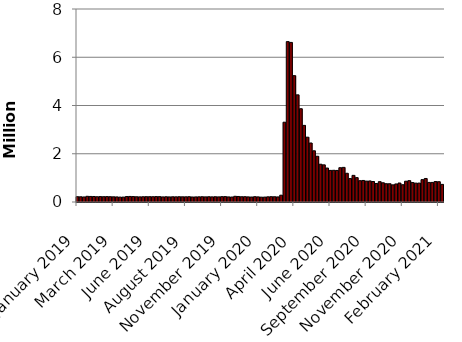
| Category | Series 0 |
|---|---|
| January 2019 | 220000 |
| January 2019 | 216000 |
| January 2019 | 209000 |
| January 2019 | 236000 |
| February 2019 | 230000 |
| February 2019 | 228000 |
| February 2019 | 218000 |
| February 2019 | 224000 |
| March 2019 | 220000 |
| March 2019 | 224000 |
| March 2019 | 219000 |
| March 2019 | 215000 |
| March 2019 | 211000 |
| April 2019 | 203000 |
| April 2019 | 203000 |
| April 2019 | 226000 |
| April 2019 | 230000 |
| May 2019 | 225000 |
| May 2019 | 217000 |
| May 2019 | 213000 |
| May 2019 | 218000 |
| June 2019 | 220000 |
| June 2019 | 220000 |
| June 2019 | 219000 |
| June 2019 | 224000 |
| June 2019 | 222000 |
| July 2019 | 211000 |
| July 2019 | 217000 |
| July 2019 | 211000 |
| July 2019 | 216000 |
| August 2019 | 214000 |
| August 2019 | 218000 |
| August 2019 | 215000 |
| August 2019 | 215000 |
| August 2019 | 219000 |
| September 2019 | 208000 |
| September 2019 | 211000 |
| September 2019 | 215000 |
| September 2019 | 218000 |
| October 2019 | 212000 |
| October 2019 | 218000 |
| September 2019 | 213000 |
| September 2019 | 217000 |
| November 2019 | 212000 |
| November 2019 | 222000 |
| November 2019 | 223000 |
| November 2019 | 211000 |
| November 2019 | 206000 |
| December 2019 | 237000 |
| December 2019 | 229000 |
| December 2019 | 218000 |
| December 2019 | 220000 |
| January 2020 | 212000 |
| January 2020 | 207000 |
| January 2020 | 220000 |
| January 2020 | 212000 |
| February 2020 | 201000 |
| February 2020 | 204000 |
| February 2020 | 215000 |
| February 2020 | 220000 |
| February 2020 | 217000 |
| March 2020 | 211000 |
| March 2020 | 282000 |
| 2020 Mar | 3307000 |
| March 2020 | 6648000 |
| April 2020 | 6615000 |
| April 2020 | 5237000 |
| April 2020 | 4442000 |
| April 2020 | 3867000 |
| May 2020 | 3176000 |
| May 2020 | 2687000 |
| May 2020 | 2446000 |
| May 2020 | 2123000 |
| May 2020 | 1897000 |
| June 2020 | 1566000 |
| June 2020 | 1540000 |
| June 2020 | 1408000 |
| June 2020 | 1310000 |
| July 2020 | 1314000 |
| July 2020 | 1308000 |
| July 2020 | 1422000 |
| July 2020 | 1435000 |
| August 2020 | 1191000 |
| August 2020 | 971000 |
| August 2020 | 1104000 |
| August 2020 | 1011000 |
| August 2020 | 884000 |
| September 2020 | 893000 |
| September 2020 | 866000 |
| September 2020 | 873000 |
| September 2020 | 849000 |
| October 2020 | 767000 |
| October 2020 | 842000 |
| October 2020 | 797000 |
| October 2020 | 758000 |
| October 2020 | 757000 |
| November 2020 | 711000 |
| November 2020 | 748000 |
| November 2020 | 787000 |
| November 2020 | 716000 |
| December 2020 | 862000 |
| December 2020 | 885000 |
| Decmeber 2020 | 806000 |
| December 2020 | 782000 |
| January 2021 | 784000 |
| January 2021 | 927000 |
| January 2021 | 975000 |
| January 2021 | 812000 |
| January 2021 | 812000 |
| February 2021 | 848000 |
| February 2021 | 841000 |
| February 2021 | 730000 |